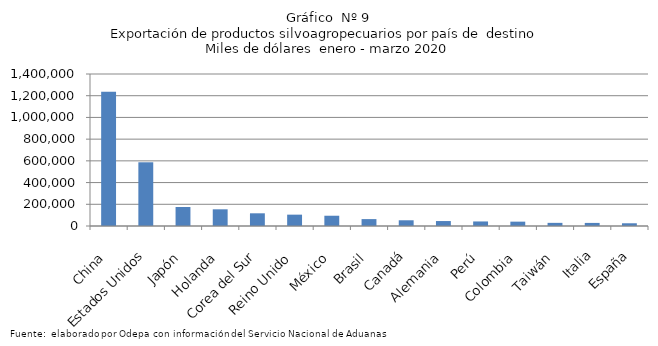
| Category | Series 0 |
|---|---|
| China | 1235470.304 |
| Estados Unidos | 586865.393 |
| Japón | 174773.847 |
| Holanda | 153753.558 |
| Corea del Sur | 116935.028 |
| Reino Unido | 104515.104 |
| México | 94572.962 |
| Brasil | 63549.367 |
| Canadá | 52683.663 |
| Alemania | 45682.106 |
| Perú | 41913.179 |
| Colombia | 40074.729 |
| Taiwán | 28958.157 |
| Italia | 28402.059 |
| España | 25133.077 |